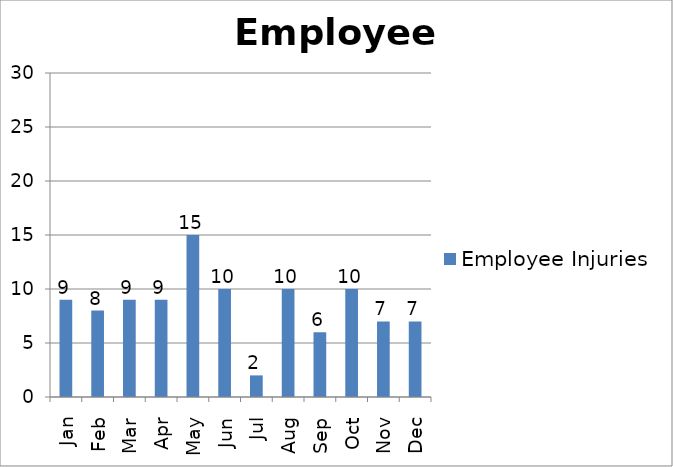
| Category | Employee Injuries |
|---|---|
| Jan | 9 |
| Feb | 8 |
| Mar | 9 |
| Apr | 9 |
| May | 15 |
| Jun | 10 |
| Jul | 2 |
| Aug | 10 |
| Sep | 6 |
| Oct | 10 |
| Nov | 7 |
| Dec | 7 |